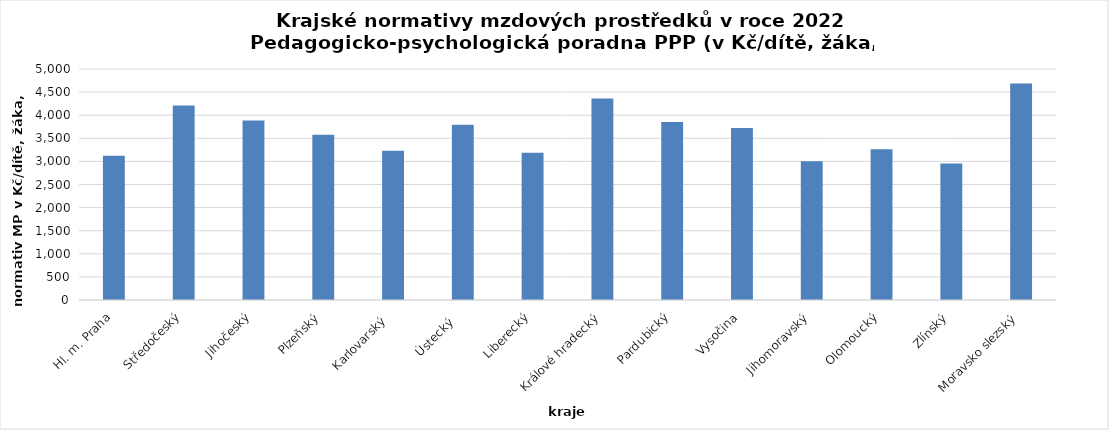
| Category | Series 0 |
|---|---|
| Hl. m. Praha | 3121.193 |
| Středočeský | 4209.652 |
| Jihočeský | 3885.634 |
| Plzeňský | 3575.807 |
| Karlovarský  | 3231.429 |
| Ústecký   | 3792.75 |
| Liberecký | 3187.103 |
| Králové hradecký | 4358.98 |
| Pardubický | 3854.136 |
| Vysočina | 3723.903 |
| Jihomoravský | 3005.309 |
| Olomoucký | 3264.209 |
| Zlínský | 2953.663 |
| Moravsko slezský | 4687.106 |